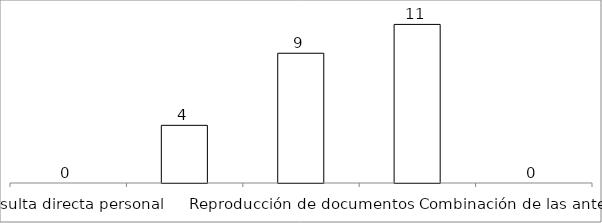
| Category | Series 0 |
|---|---|
| Consulta directa personal | 0 |
| Consulta directa electrónica | 4 |
| Reproducción de documentos | 9 |
| Elaboración de informes | 11 |
| Combinación de las anteriores | 0 |